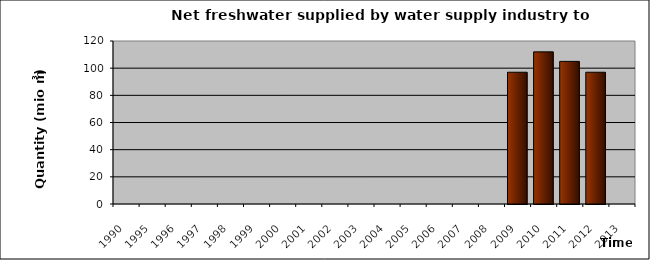
| Category | 1990 1995 1996 1997 1998 1999 2000 2001 2002 2003 2004 2005 2006 2007 2008 2009 2010 2011 2012 2013 |
|---|---|
| 1990 | 0 |
| 1995 | 0 |
| 1996 | 0 |
| 1997 | 0 |
| 1998 | 0 |
| 1999 | 0 |
| 2000 | 0 |
| 2001 | 0 |
| 2002 | 0 |
| 2003 | 0 |
| 2004 | 0 |
| 2005 | 0 |
| 2006 | 0 |
| 2007 | 0 |
| 2008 | 0 |
| 2009 | 97 |
| 2010 | 112 |
| 2011 | 105 |
| 2012 | 97 |
| 2013 | 0 |